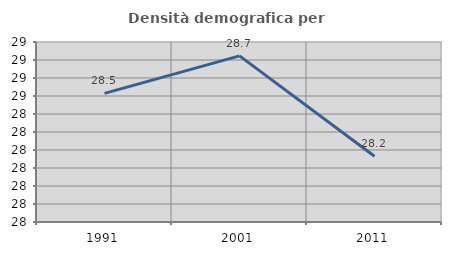
| Category | Densità demografica |
|---|---|
| 1991.0 | 28.515 |
| 2001.0 | 28.723 |
| 2011.0 | 28.166 |